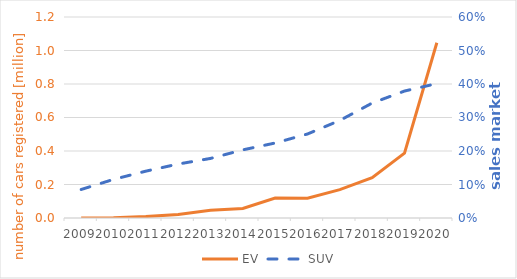
| Category | EV |
|---|---|
| 2009.0 | 132 |
| 2010.0 | 804 |
| 2011.0 | 8459 |
| 2012.0 | 20827 |
| 2013.0 | 46153 |
| 2014.0 | 56510 |
| 2015.0 | 119643 |
| 2016.0 | 118534 |
| 2017.0 | 169115 |
| 2018.0 | 240136 |
| 2019.0 | 387252 |
| 2020.0 | 1046067 |